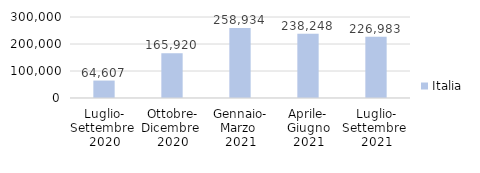
| Category | Italia |
|---|---|
| Luglio-
Settembre 
2020 | 64606.652 |
| Ottobre-
Dicembre 
2020 | 165920.489 |
| Gennaio-
Marzo 
2021 | 258933.889 |
| Aprile-
Giugno
2021 | 238247.791 |
| Luglio-
Settembre 
2021 | 226983 |